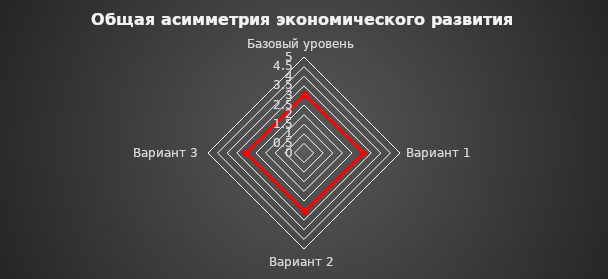
| Category | Общая асимметрия экономического развития региона |
|---|---|
| Базовый уровень | 3.051 |
| Вариант 1 | 3.051 |
| Вариант 2 | 3.051 |
| Вариант 3 | 3.051 |